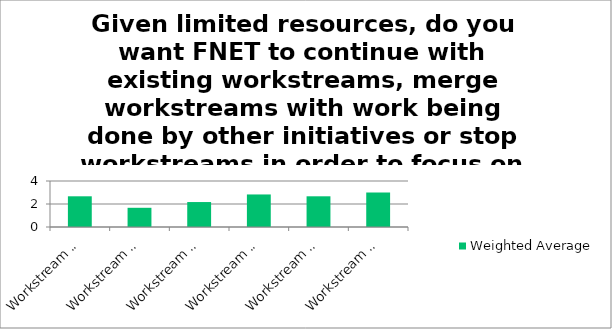
| Category | Weighted Average |
|---|---|
| Workstream 1: Risk Assessment & Mitigation | 2.67 |
| Workstream 2: Spices | 1.67 |
| Workstream 2: Warehousing and Logistics | 2.17 |
| Workstream 2: Worker Representation | 2.83 |
| Workstream 2: Recruitment Fees | 2.67 |
| Workstream 3: Ethical Engagement | 3 |